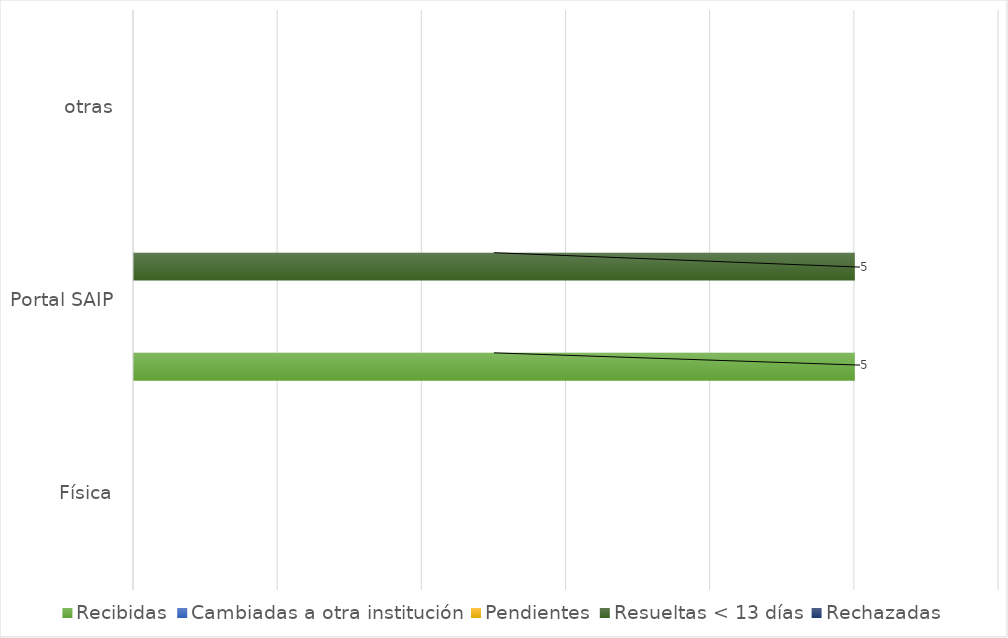
| Category | Recibidas | Cambiadas a otra institución | Pendientes | Resueltas < 13 días | Rechazadas |
|---|---|---|---|---|---|
| Física | 0 | 0 | 0 | 0 | 0 |
| Portal SAIP | 5 | 0 | 0 | 5 | 0 |
| otras | 0 | 0 | 0 | 0 | 0 |